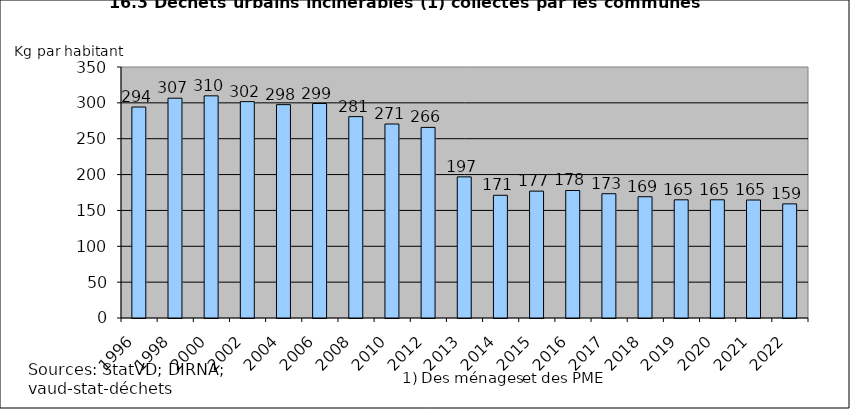
| Category | Quantités (kg/hab) |
|---|---|
| 1996.0 | 294.2 |
| 1998.0 | 306.5 |
| 2000.0 | 309.8 |
| 2002.0 | 301.7 |
| 2004.0 | 297.5 |
| 2006.0 | 299.1 |
| 2008.0 | 280.8 |
| 2010.0 | 270.5 |
| 2012.0 | 265.8 |
| 2013.0 | 196.8 |
| 2014.0 | 171.1 |
| 2015.0 | 176.9 |
| 2016.0 | 177.8 |
| 2017.0 | 173.3 |
| 2018.0 | 169.1 |
| 2019.0 | 164.8 |
| 2020.0 | 164.829 |
| 2021.0 | 164.533 |
| 2022.0 | 159.141 |